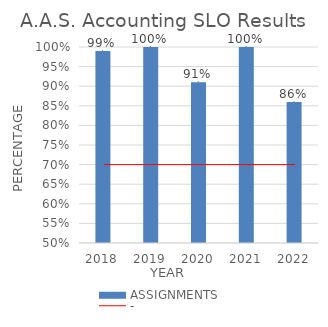
| Category | ASSIGNMENTS |
|---|---|
| 0 | 0.99 |
| 1 | 1 |
| 2 | 0.91 |
| 3 | 1 |
| 4 | 0.86 |